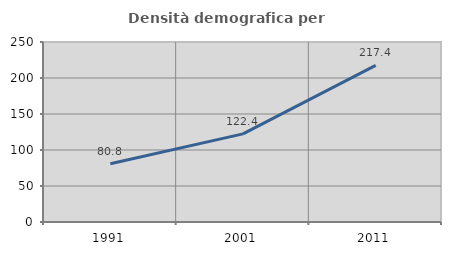
| Category | Densità demografica |
|---|---|
| 1991.0 | 80.783 |
| 2001.0 | 122.399 |
| 2011.0 | 217.425 |